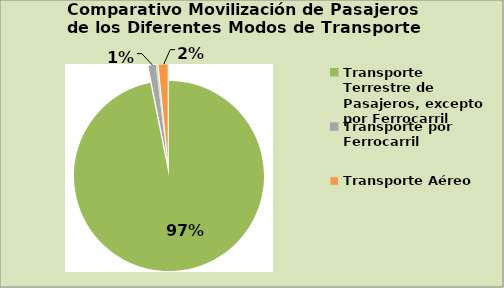
| Category | Series 0 |
|---|---|
| Transporte Terrestre de Pasajeros, excepto por Ferrocarril | 3363 |
| Transporte por Ferrocarril | 43.8 |
| Transporte por Agua | 10.3 |
| Transporte Aéreo | 55.1 |